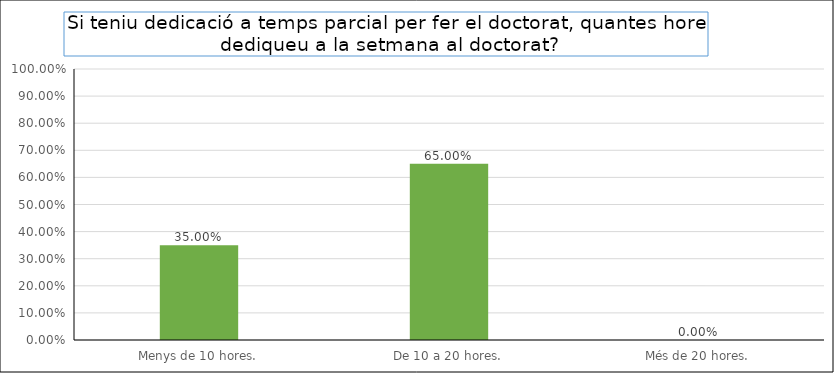
| Category | Series 0 |
|---|---|
| Menys de 10 hores. | 0.35 |
| De 10 a 20 hores. | 0.65 |
| Més de 20 hores. | 0 |